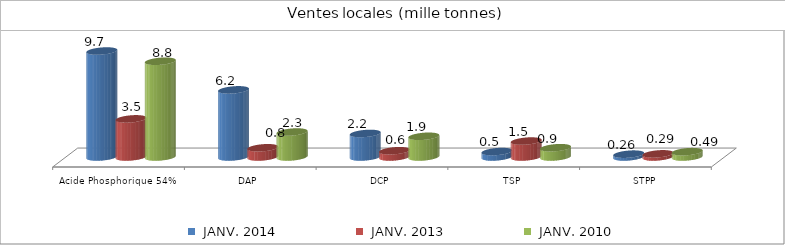
| Category |  JANV. 2014 |  JANV. 2013 |  JANV. 2010 |
|---|---|---|---|
| Acide Phosphorique 54% | 9.717 | 3.496 | 8.78 |
| DAP | 6.156 | 0.845 | 2.29 |
| DCP | 2.158 | 0.575 | 1.899 |
| TSP | 0.5 | 1.461 | 0.851 |
| STPP | 0.262 | 0.288 | 0.49 |